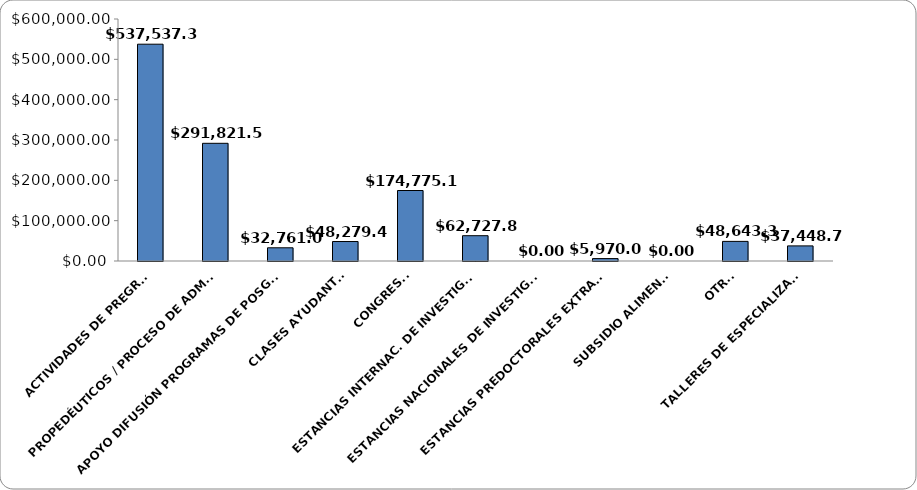
| Category | Series 0 |
|---|---|
| ACTIVIDADES DE PREGRADO | 537537.313 |
| PROPEDÉUTICOS / PROCESO DE ADMISIÓN | 291821.56 |
| APOYO DIFUSIÓN PROGRAMAS DE POSGRADO | 32761 |
| CLASES AYUDANTÍAS | 48279.4 |
| CONGRESOS | 174775.108 |
| ESTANCIAS INTERNAC. DE INVESTIGACIÓN | 62727.84 |
| ESTANCIAS NACIONALES DE INVESTIGACIÓN | 0 |
| ESTANCIAS PREDOCTORALES EXTRANJERO | 5970 |
| SUBSIDIO ALIMENTOS | 0 |
| OTROS | 48643.364 |
| TALLERES DE ESPECIALIZACIÓN | 37448.71 |